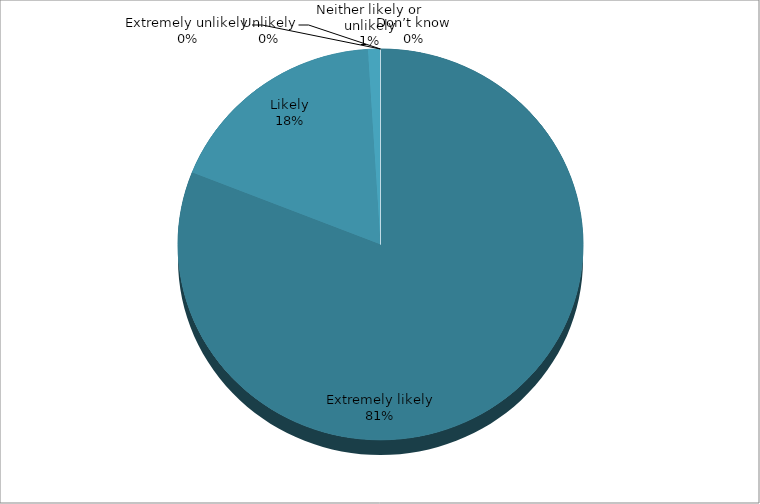
| Category | Series 0 |
|---|---|
| Extremely likely | 81 |
| Likely | 18 |
| Neither likely or unlikely | 1 |
| Unlikely | 0 |
| Extremely unlikely | 0 |
| Don’t know | 0 |